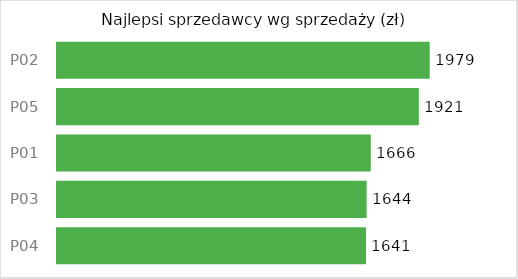
| Category | Suma |
|---|---|
| P04 | 1641 |
| P03 | 1644 |
| P01 | 1666 |
| P05 | 1921 |
| P02 | 1979 |